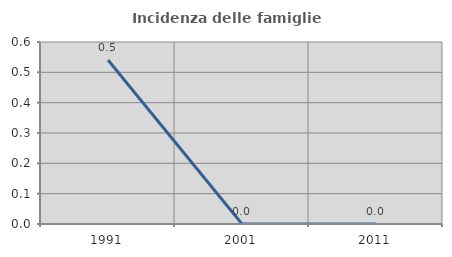
| Category | Incidenza delle famiglie numerose |
|---|---|
| 1991.0 | 0.541 |
| 2001.0 | 0 |
| 2011.0 | 0 |